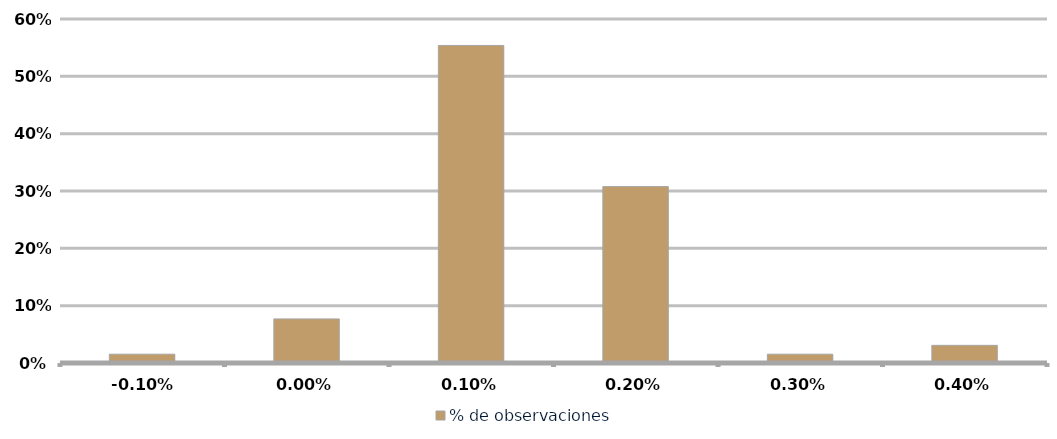
| Category | % de observaciones  |
|---|---|
| -0.001 | 0.015 |
| 0.0 | 0.077 |
| 0.001 | 0.554 |
| 0.002 | 0.308 |
| 0.003 | 0.015 |
| 0.004 | 0.031 |